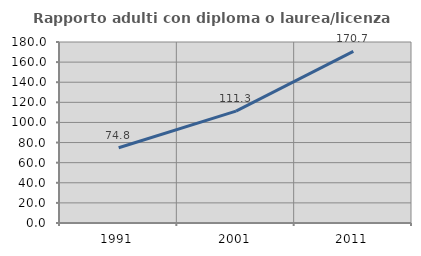
| Category | Rapporto adulti con diploma o laurea/licenza media  |
|---|---|
| 1991.0 | 74.839 |
| 2001.0 | 111.314 |
| 2011.0 | 170.662 |